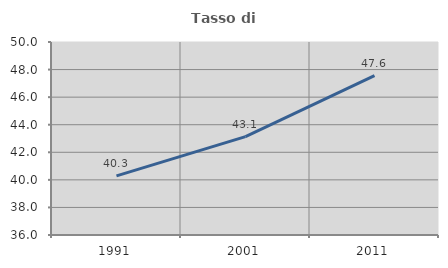
| Category | Tasso di occupazione   |
|---|---|
| 1991.0 | 40.291 |
| 2001.0 | 43.133 |
| 2011.0 | 47.561 |